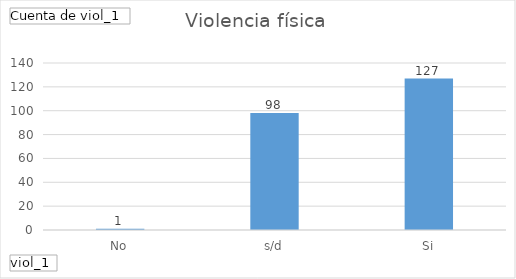
| Category | Total |
|---|---|
| No | 1 |
| s/d | 98 |
| Si | 127 |